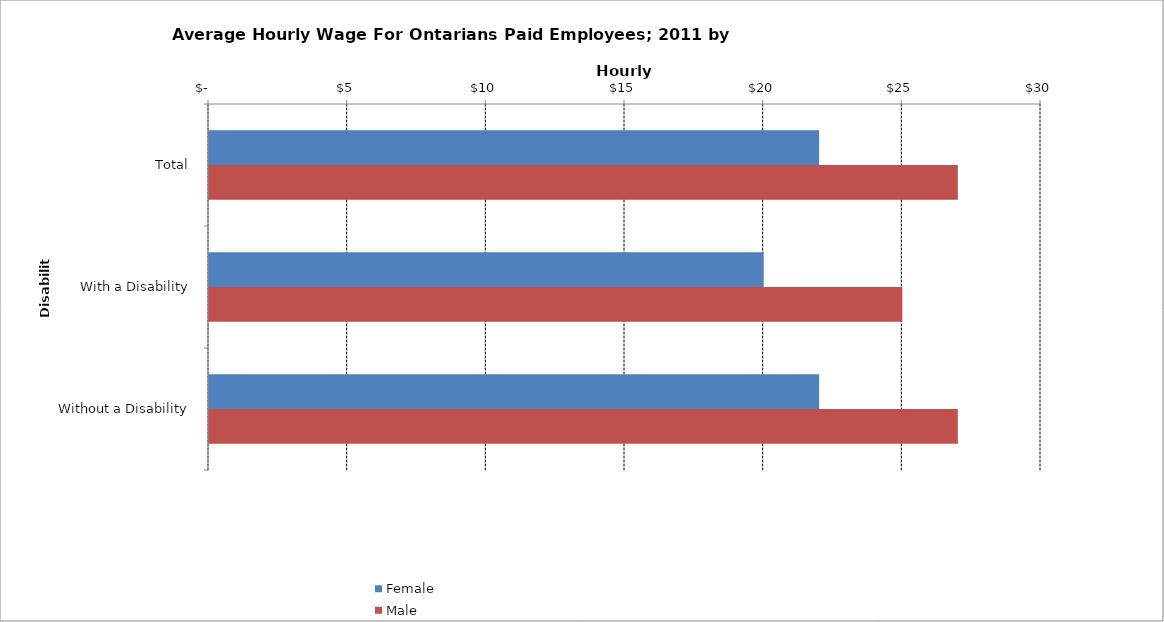
| Category | Female | Male |
|---|---|---|
| Total | 22 | 27 |
|  With a Disability  | 20 | 25 |
|  Without a Disability  | 22 | 27 |